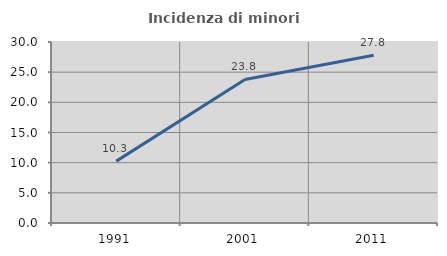
| Category | Incidenza di minori stranieri |
|---|---|
| 1991.0 | 10.256 |
| 2001.0 | 23.79 |
| 2011.0 | 27.797 |